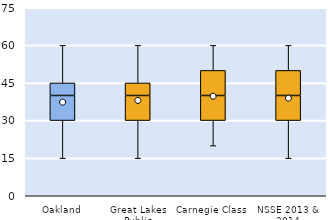
| Category | 25th | 50th | 75th |
|---|---|---|---|
| Oakland | 30 | 10 | 5 |
| Great Lakes Public | 30 | 10 | 5 |
| Carnegie Class | 30 | 10 | 10 |
| NSSE 2013 & 2014 | 30 | 10 | 10 |